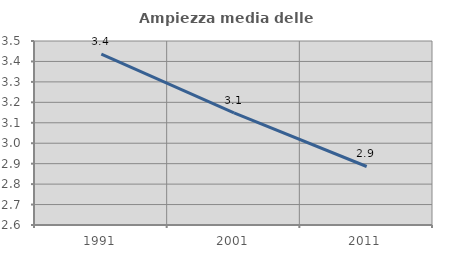
| Category | Ampiezza media delle famiglie |
|---|---|
| 1991.0 | 3.436 |
| 2001.0 | 3.148 |
| 2011.0 | 2.886 |